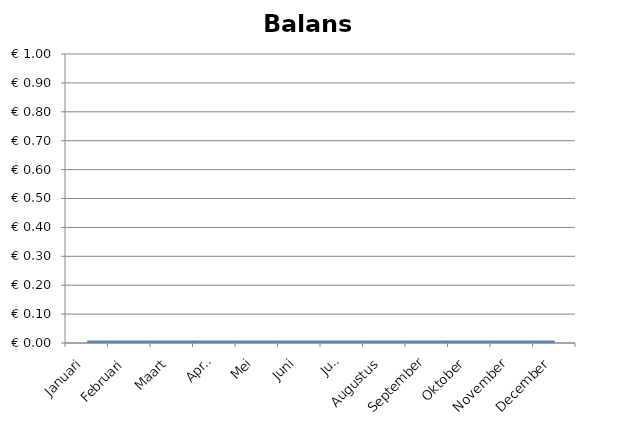
| Category | Balans |
|---|---|
| Januari | 0 |
| Februari | 0 |
| Maart | 0 |
| April | 0 |
| Mei | 0 |
| Juni | 0 |
| Juli | 0 |
| Augustus | 0 |
| September | 0 |
| Oktober | 0 |
| November | 0 |
| December | 0 |